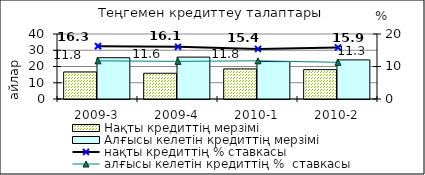
| Category | Нақты кредиттің мерзімі  | Алғысы келетін кредиттің мерзімі  |
|---|---|---|
| 2009-3 | 16.66 | 25.4 |
| 2009-4 | 15.84 | 25.78 |
| 2010-1 | 18.51 | 23.02 |
| 2010-2 | 18.06 | 24.07 |